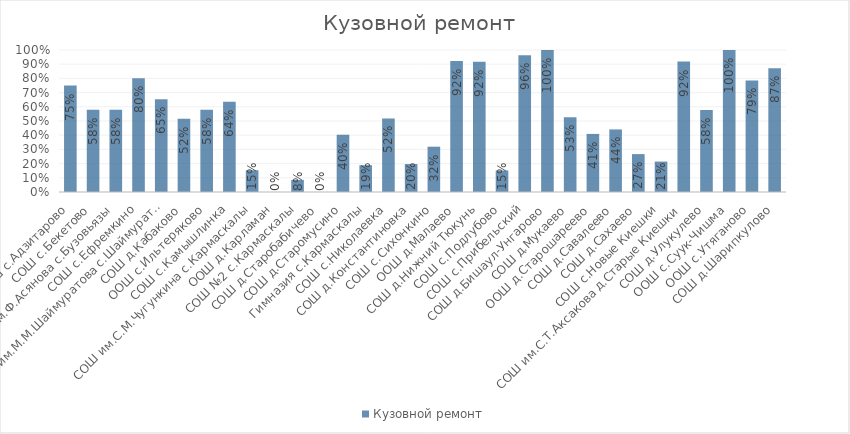
| Category | Кузовной ремонт |
|---|---|
| СОШ с.Адзитарово | 0.75 |
| СОШ с.Бекетово | 0.579 |
| СОШ им.Ф.Асянова с.Бузовьязы | 0.58 |
| СОШ с.Ефремкино | 0.802 |
| СОШ им.М.М.Шаймуратова с.Шаймуратово | 0.653 |
| СОШ д.Кабаково | 0.516 |
| ООШ с.Ильтеряково | 0.579 |
| СОШ с.Камышлинка | 0.636 |
| СОШ им.С.М.Чугункина с.Кармаскалы | 0.153 |
| ООШ д.Карламан | 0 |
| СОШ №2 с.Кармаскалы | 0.085 |
| СОШ д.Старобабичево | 0 |
| СОШ д.Старомусино | 0.403 |
| Гимназия с.Кармаскалы | 0.189 |
| СОШ с.Николаевка | 0.518 |
| СОШ д.Константиновка | 0.197 |
| СОШ с.Сихонкино | 0.319 |
| ООШ д.Малаево | 0.923 |
| СОШ д.Нижний Тюкунь | 0.917 |
| СОШ с.Подлубово | 0.152 |
| СОШ с.Прибельский | 0.964 |
| СОШ д.Бишаул-Унгарово | 1 |
| СОШ д.Мукаево | 0.526 |
| ООШ д.Старошареево | 0.409 |
| СОШ д.Савалеево | 0.441 |
| СОШ д.Сахаево | 0.267 |
| СОШ с.Новые Киешки | 0.214 |
| СОШ им.С.Т.Аксакова д.Старые Киешки | 0.918 |
| СОШ д.Улукулево | 0.578 |
| ООШ с.Суук-Чишма | 1 |
| ООШ с.Утяганово | 0.786 |
| СОШ д.Шарипкулово | 0.872 |